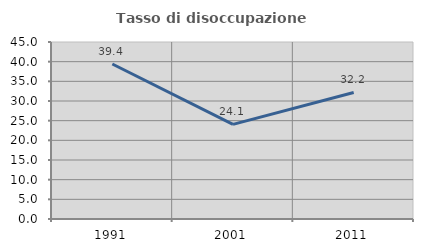
| Category | Tasso di disoccupazione giovanile  |
|---|---|
| 1991.0 | 39.405 |
| 2001.0 | 24.06 |
| 2011.0 | 32.174 |